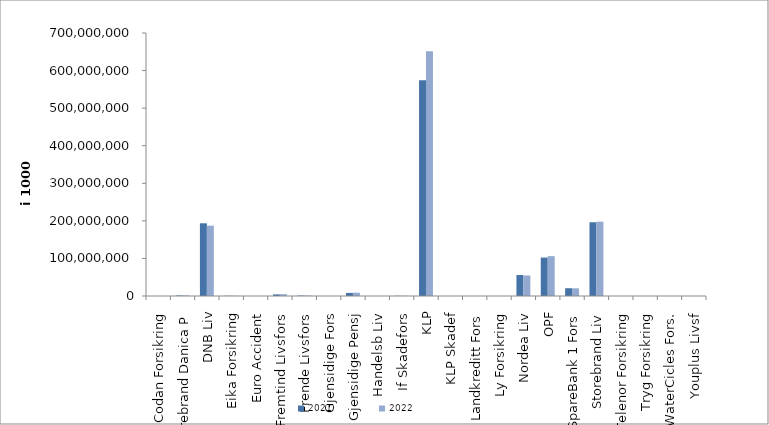
| Category | 2021 | 2022 |
|---|---|---|
| Codan Forsikring | 0 | 0 |
| Storebrand Danica P | 1398802.868 | 1474107.358 |
| DNB Liv | 193517916 | 187258081.981 |
| Eika Forsikring | 572507 | 620181 |
| Euro Accident | 0 | 0 |
| Fremtind Livsfors | 4274504.159 | 4825016.001 |
| Frende Livsfors | 1050219 | 1264588 |
| Gjensidige Fors | 0 | 0 |
| Gjensidige Pensj | 8230173 | 8842879 |
| Handelsb Liv | 22010.537 | 15305 |
| If Skadefors | 556565.278 | 549814.806 |
| KLP | 574122994.448 | 651711055.011 |
| KLP Skadef | 72087.317 | 105413.077 |
| Landkreditt Fors | 0 | 0 |
| Ly Forsikring | 0 | 0 |
| Nordea Liv | 55808862 | 54578180 |
| OPF | 102259830 | 106050686 |
| SpareBank 1 Fors | 20710069.297 | 20441957 |
| Storebrand Liv | 196253398.08 | 197874814.023 |
| Telenor Forsikring | 0 | 0 |
| Tryg Forsikring | 0 | 0 |
| WaterCicles Fors. | 0 | 0 |
| Youplus Livsf | 0 | 5826 |